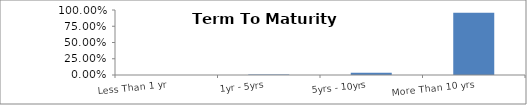
| Category | Series 0 |
|---|---|
| Less Than 1 yr | 0 |
| 1yr - 5yrs | 0.008 |
| 5yrs - 10yrs | 0.035 |
| More Than 10 yrs | 0.956 |